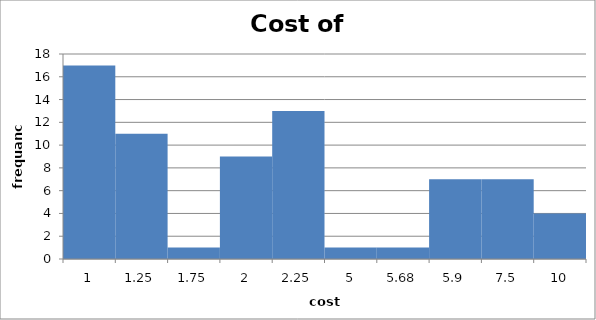
| Category | Total |
|---|---|
| 1 | 17 |
| 1.25 | 11 |
| 1.75 | 1 |
| 2 | 9 |
| 2.25 | 13 |
| 5 | 1 |
| 5.68 | 1 |
| 5.9 | 7 |
| 7.5 | 7 |
| 10 | 4 |